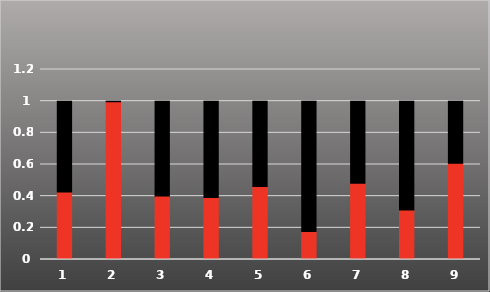
| Category | Series 1 |
|---|---|
| 0 | 0.573 |
| 1 | 0.004 |
| 2 | 0.599 |
| 3 | 0.609 |
| 4 | 0.539 |
| 5 | 0.823 |
| 6 | 0.518 |
| 7 | 0.688 |
| 8 | 0.392 |